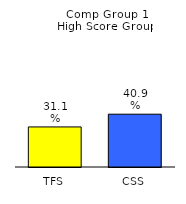
| Category | Series 0 |
|---|---|
| TFS | 0.311 |
| CSS | 0.409 |